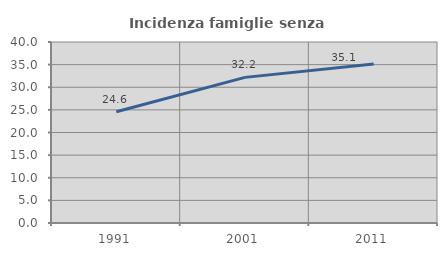
| Category | Incidenza famiglie senza nuclei |
|---|---|
| 1991.0 | 24.582 |
| 2001.0 | 32.183 |
| 2011.0 | 35.12 |